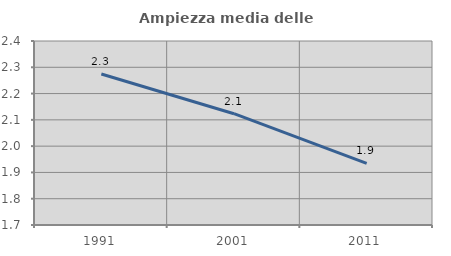
| Category | Ampiezza media delle famiglie |
|---|---|
| 1991.0 | 2.275 |
| 2001.0 | 2.123 |
| 2011.0 | 1.934 |